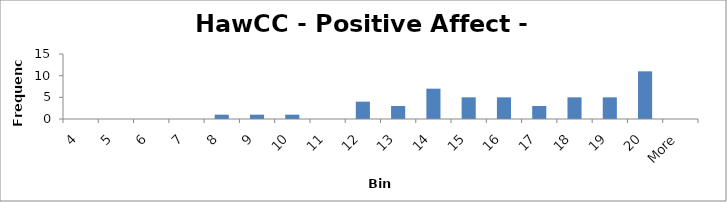
| Category | Frequency |
|---|---|
| 4 | 0 |
| 5 | 0 |
| 6 | 0 |
| 7 | 0 |
| 8 | 1 |
| 9 | 1 |
| 10 | 1 |
| 11 | 0 |
| 12 | 4 |
| 13 | 3 |
| 14 | 7 |
| 15 | 5 |
| 16 | 5 |
| 17 | 3 |
| 18 | 5 |
| 19 | 5 |
| 20 | 11 |
| More | 0 |